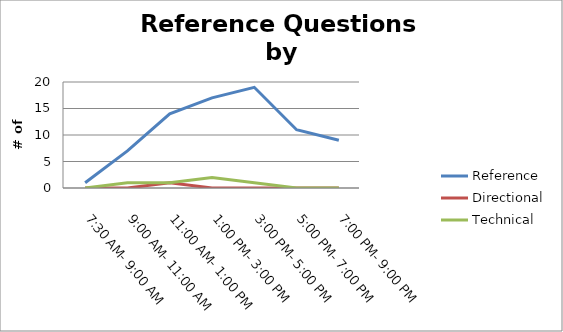
| Category | Reference | Directional | Technical |
|---|---|---|---|
| 7:30 AM- 9:00 AM | 1 | 0 | 0 |
| 9:00 AM- 11:00 AM | 7 | 0 | 1 |
| 11:00 AM- 1:00 PM | 14 | 1 | 1 |
| 1:00 PM- 3:00 PM | 17 | 0 | 2 |
| 3:00 PM- 5:00 PM | 19 | 0 | 1 |
| 5:00 PM- 7:00 PM | 11 | 0 | 0 |
| 7:00 PM- 9:00 PM | 9 | 0 | 0 |